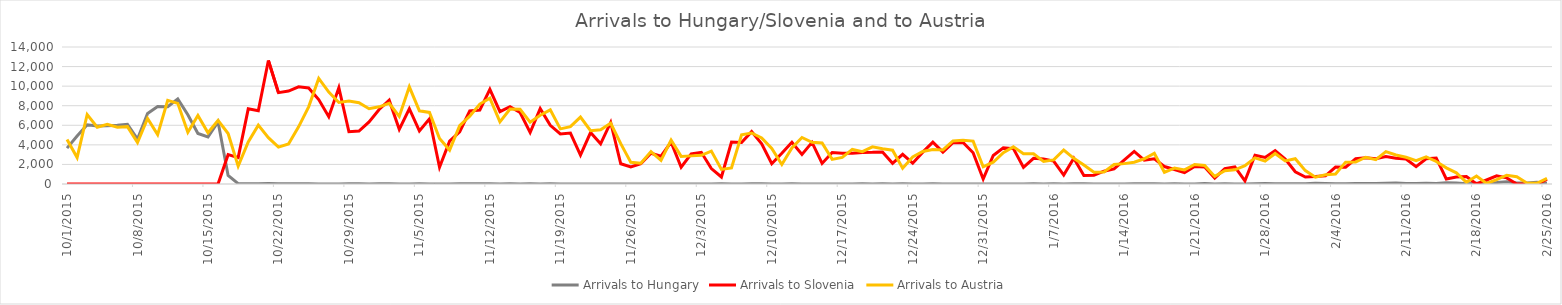
| Category | Arrivals to Hungary | Arrivals to Slovenia | Arrivals to Austria |
|---|---|---|---|
| 10/1/15 | 3667 | 0 | 4550 |
| 10/2/15 | 4897 | 0 | 2700 |
| 10/3/15 | 6056 | 0 | 7100 |
| 10/4/15 | 5925 | 0 | 5800 |
| 10/5/15 | 5952 | 0 | 6100 |
| 10/6/15 | 6000 | 0 | 5800 |
| 10/7/15 | 6103 | 0 | 5861 |
| 10/8/15 | 4583 | 6 | 4229 |
| 10/9/15 | 7215 | 0 | 6700 |
| 10/10/15 | 7907 | 0 | 5050 |
| 10/11/15 | 7897 | 0 | 8540 |
| 10/12/15 | 8702 | 0 | 8240 |
| 10/13/15 | 7081 | 0 | 5280 |
| 10/14/15 | 5157 | 0 | 7000 |
| 10/15/15 | 4808 | 0 | 5235 |
| 10/16/15 | 6353 | 0 | 6500 |
| 10/17/15 | 870 | 3000 | 5155 |
| 10/18/15 | 41 | 2700 | 1822 |
| 10/19/15 | 22 | 7677 | 4300 |
| 10/20/15 | 36 | 7478 | 6017 |
| 10/21/15 | 39 | 12616 | 4737 |
| 10/22/15 | 32 | 9339 | 3767 |
| 10/23/15 | 29 | 9500 | 4092 |
| 10/24/15 | 35 | 9925 | 5841 |
| 10/25/15 | 34 | 9818 | 7882 |
| 10/26/15 | 12 | 8625 | 10784 |
| 10/27/15 | 7 | 6877 | 9390 |
| 10/28/15 | 4 | 9848 | 8336 |
| 10/29/15 | 23 | 5341 | 8473 |
| 10/30/15 | 18 | 5409 | 8302 |
| 10/31/15 | 10 | 6344 | 7691 |
| 11/1/15 | 14 | 7611 | 7887 |
| 11/2/15 | 31 | 8568 | 8243 |
| 11/3/15 | 8 | 5591 | 6900 |
| 11/4/15 | 10 | 7693 | 9930 |
| 11/5/15 | 18 | 5426 | 7478 |
| 11/6/15 | 4 | 6655 | 7315 |
| 11/7/15 | 8 | 1716 | 4648 |
| 11/8/15 | 9 | 4381 | 3465 |
| 11/9/15 | 25 | 5341 | 5962 |
| 11/10/15 | 14 | 7457 | 6933 |
| 11/11/15 | 13 | 7554 | 8169 |
| 11/12/15 | 23 | 9681 | 8777 |
| 11/13/15 | 6 | 7397 | 6351 |
| 11/14/15 | 21 | 7905 | 7659 |
| 11/15/15 | 8 | 7300 | 7632 |
| 11/16/15 | 15 | 5261 | 6319 |
| 11/17/15 | 5 | 7704 | 7026 |
| 11/18/15 | 15 | 5998 | 7577 |
| 11/19/15 | 4 | 5119 | 5635 |
| 11/20/15 | 9 | 5211 | 5865 |
| 11/21/15 | 2 | 2952 | 6836 |
| 11/22/15 | 11 | 5260 | 5446 |
| 11/23/15 | 4 | 4102 | 5546 |
| 11/24/15 | 4 | 6297 | 6204 |
| 11/25/15 | 6 | 2070 | 4122 |
| 11/26/15 | 10 | 1742 | 2211 |
| 11/27/15 | 2 | 2065 | 2120 |
| 11/28/15 | 6 | 3139 | 3320 |
| 11/29/15 | 3 | 2843 | 2407 |
| 11/30/15 | 7 | 4274 | 4482 |
| 12/1/15 | 4 | 1709 | 2821 |
| 12/2/15 | 4 | 3077 | 2874 |
| 12/3/15 | 9 | 3237 | 2935 |
| 12/4/15 | 1 | 1577 | 3366 |
| 12/5/15 | 31 | 715 | 1493 |
| 12/6/15 | 7 | 4288 | 1643 |
| 12/7/15 | 0 | 4240 | 5035 |
| 12/8/15 | 13 | 5351 | 5210 |
| 12/9/15 | 14 | 4103 | 4714 |
| 12/10/15 | 3 | 2078 | 3623 |
| 12/11/15 | 0 | 3149 | 2000 |
| 12/12/15 | 13 | 4271 | 3675 |
| 12/13/15 | 10 | 3016 | 4754 |
| 12/14/15 | 3 | 4250 | 4263 |
| 12/15/15 | 2 | 2098 | 4193 |
| 12/16/15 | 6 | 3214 | 2519 |
| 12/17/15 | 0 | 3135 | 2717 |
| 12/18/15 | 11 | 3150 | 3532 |
| 12/19/15 | 31 | 3222 | 3305 |
| 12/20/15 | 8 | 3233 | 3800 |
| 12/21/15 | 25 | 3278 | 3611 |
| 12/22/15 | 1 | 2118 | 3451 |
| 12/23/15 | 21 | 3030 | 1613 |
| 12/24/15 | 8 | 2131 | 2764 |
| 12/25/15 | 2 | 3257 | 3321 |
| 12/26/15 | 17 | 4274 | 3532 |
| 12/27/15 | 10 | 3253 | 3476 |
| 12/28/15 | 0 | 4228 | 4394 |
| 12/29/15 | 0 | 4239 | 4468 |
| 12/30/15 | 11 | 3195 | 4386 |
| 12/31/15 | 5 | 511 | 1756 |
| 1/1/16 | 0 | 2914 | 2226 |
| 1/2/16 | 0 | 3690 | 3199 |
| 1/3/16 | 0 | 3619 | 3793 |
| 1/4/16 | 0 | 1708 | 3085 |
| 1/5/16 | 18 | 2626 | 3091 |
| 1/6/16 | 5 | 2550 | 2299 |
| 1/7/16 | 31 | 2337 | 2466 |
| 1/8/16 | 0 | 916 | 3472 |
| 1/9/16 | 15 | 2630 | 2619 |
| 1/10/16 | 28 | 880 | 1934 |
| 1/11/16 | 7 | 897 | 1204 |
| 1/12/16 | 2 | 1308 | 1231 |
| 1/13/16 | 0 | 1544 | 1991 |
| 1/14/16 | 4 | 2449 | 2082 |
| 1/15/16 | 30 | 3330 | 2219 |
| 1/16/16 | 30 | 2435 | 2578 |
| 1/17/16 | 30 | 2570 | 3141 |
| 1/18/16 | 9 | 1783 | 1203 |
| 1/19/16 | 29 | 1476 | 1630 |
| 1/20/16 | 0 | 1154 | 1439 |
| 1/21/16 | 10 | 1787 | 1989 |
| 1/22/16 | 47 | 1738 | 1885 |
| 1/23/16 | 10 | 606 | 777 |
| 1/24/16 | 15 | 1564 | 1366 |
| 1/25/16 | 5 | 1746 | 1450 |
| 1/26/16 | 4 | 326 | 1867 |
| 1/27/16 | 36 | 2935 | 2670 |
| 1/28/16 | 51 | 2719 | 2340 |
| 1/29/16 | 38 | 3416 | 3121 |
| 1/30/16 | 38 | 2556 | 2351 |
| 1/31/16 | 38 | 1249 | 2579 |
| 2/1/16 | 31 | 716 | 1367 |
| 2/2/16 | 69 | 765 | 690 |
| 2/3/16 | 46 | 841 | 937 |
| 2/4/16 | 31 | 1733 | 1026 |
| 2/5/16 | 19 | 1713 | 2235 |
| 2/6/16 | 49 | 2580 | 2252 |
| 2/7/16 | 53 | 2694 | 2737 |
| 2/8/16 | 48 | 2582 | 2490 |
| 2/9/16 | 72 | 2805 | 3314 |
| 2/10/16 | 104 | 2637 | 2968 |
| 2/11/16 | 54 | 2547 | 2731 |
| 2/12/16 | 39 | 1774 | 2378 |
| 2/13/16 | 66 | 2576 | 2781 |
| 2/14/16 | 51 | 2660 | 2301 |
| 2/15/16 | 119 | 516 | 1651 |
| 2/16/16 | 93 | 715 | 1143 |
| 2/17/16 | 34 | 769 | 181 |
| 2/18/16 | 73 | 0 | 817 |
| 2/19/16 | 113 | 408 | 50 |
| 2/20/16 | 151 | 828 | 453 |
| 2/21/16 | 237 | 623 | 899 |
| 2/22/16 | 103 | 0 | 744 |
| 2/23/16 | 112 | 0 | 111 |
| 2/24/16 | 166 | 0 | 75 |
| 2/25/16 | 76 | 478 | 583 |